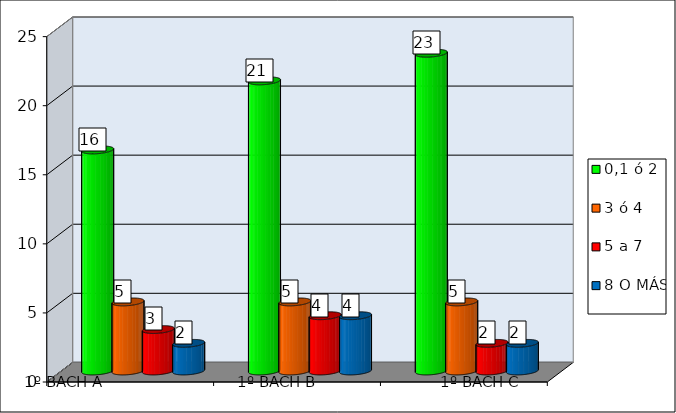
| Category | 0,1 ó 2  | 3 ó 4 | 5 a 7 | 8 O MÁS |
|---|---|---|---|---|
|  | 16 | 5 | 3 | 2 |
|  | 21 | 5 | 4 | 4 |
|  | 23 | 5 | 2 | 2 |